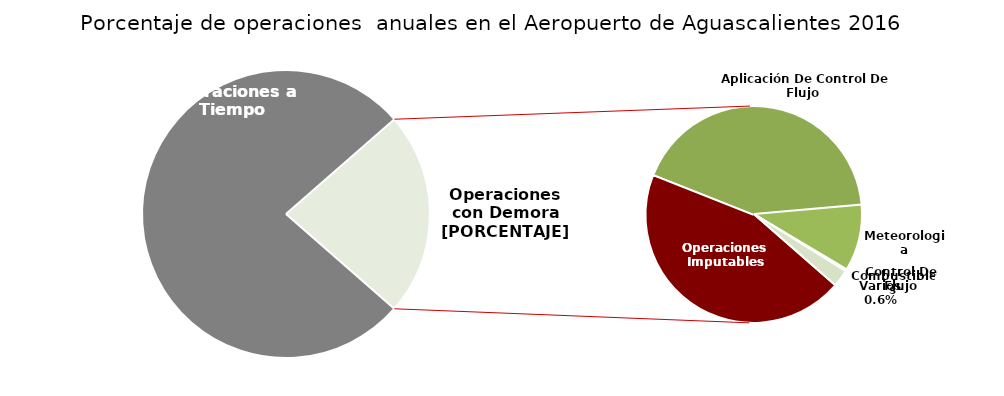
| Category | Series 0 |
|---|---|
| Operaciones a Tiempo | 8075 |
| Operaciones Imputables | 1067 |
| Aplicación De Control De Flujo  | 1020 |
| Meteorologia | 238 |
| Combustibles | 4 |
| Control De Flujo | 4 |
| Varios | 61 |